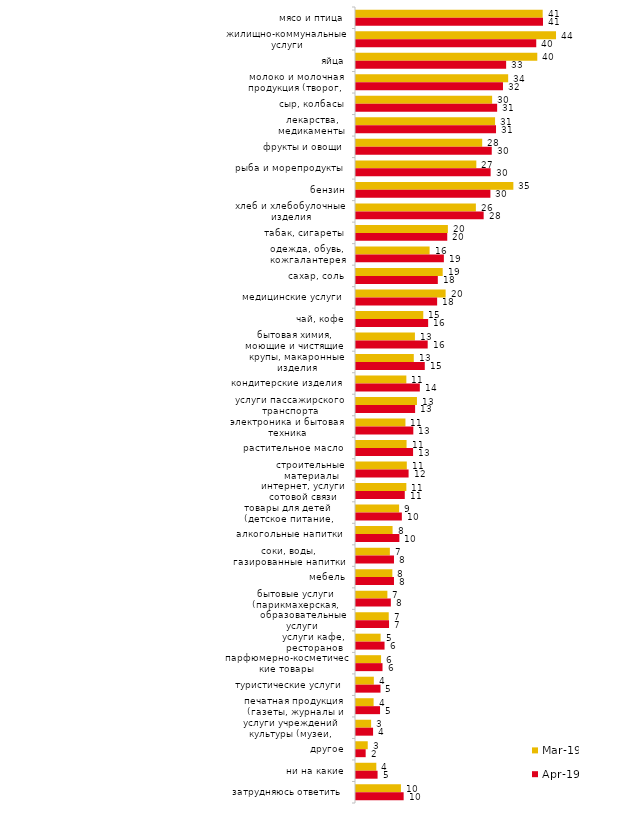
| Category | мар.19 | апр.19 |
|---|---|---|
| мясо и птица | 41.124 | 41.188 |
| жилищно-коммунальные услуги | 44.058 | 39.703 |
| яйца | 39.93 | 33.069 |
| молоко и молочная продукция (творог, кефир, масло и т.д.) | 33.516 | 32.376 |
| сыр, колбасы | 29.985 | 31.089 |
| лекарства, медикаменты | 30.632 | 30.842 |
| фрукты и овощи | 27.797 | 29.901 |
| рыба и морепродукты | 26.504 | 29.653 |
| бензин | 34.659 | 29.604 |
| хлеб и хлебобулочные изделия | 26.405 | 28.119 |
| табак, сигареты | 20.239 | 20.099 |
| одежда, обувь, кожгалантерея | 16.211 | 19.356 |
| сахар, соль | 19.095 | 18.02 |
| медицинские услуги | 19.741 | 17.871 |
| чай, кофе | 14.818 | 15.891 |
| бытовая химия, моющие и чистящие средства | 12.979 | 15.792 |
| крупы, макаронные изделия | 12.73 | 15.149 |
| кондитерские изделия | 11.089 | 14.059 |
| услуги пассажирского транспорта | 13.426 | 13.02 |
| электроника и бытовая техника | 10.89 | 12.624 |
| растительное масло | 11.139 | 12.574 |
| строительные материалы | 11.188 | 11.584 |
| интернет, услуги сотовой связи | 11.089 | 10.743 |
| товары для детей (детское питание, подгузники, игрушки и т.п.) | 9.498 | 10.099 |
| алкогольные напитки | 8.056 | 9.554 |
| соки, воды, газированные напитки | 7.459 | 8.366 |
| мебель | 8.006 | 8.366 |
| бытовые услуги (парикмахерская, химчистка, ателье и т.д.) | 6.912 | 7.673 |
| образовательные услуги | 7.21 | 7.277 |
| услуги кафе, ресторанов | 5.42 | 6.287 |
| парфюмерно-косметические товары | 5.52 | 5.842 |
| туристические услуги | 3.928 | 5.396 |
| печатная продукция (газеты, журналы и т.п.) | 3.879 | 5.297 |
| услуги учреждений культуры (музеи, театры, кинотеатры и т.п.) | 3.332 | 3.762 |
| другое | 2.586 | 2.129 |
| ни на какие | 4.475 | 4.752 |
| затрудняюсь ответить | 9.896 | 10.495 |